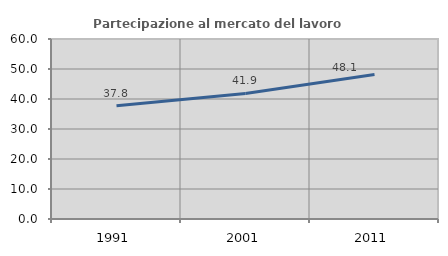
| Category | Partecipazione al mercato del lavoro  femminile |
|---|---|
| 1991.0 | 37.753 |
| 2001.0 | 41.868 |
| 2011.0 | 48.146 |